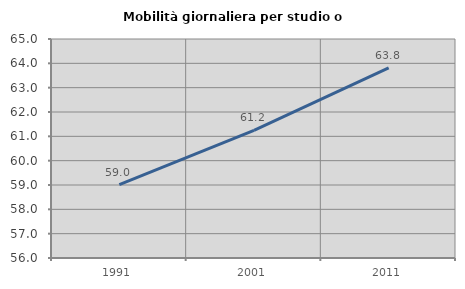
| Category | Mobilità giornaliera per studio o lavoro |
|---|---|
| 1991.0 | 59.02 |
| 2001.0 | 61.242 |
| 2011.0 | 63.817 |